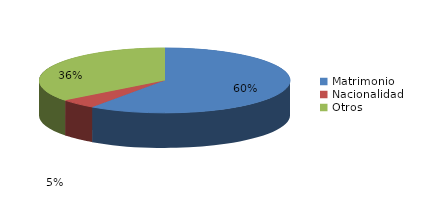
| Category | Series 0 |
|---|---|
| Matrimonio | 402 |
| Nacionalidad | 32 |
| Otros | 239 |